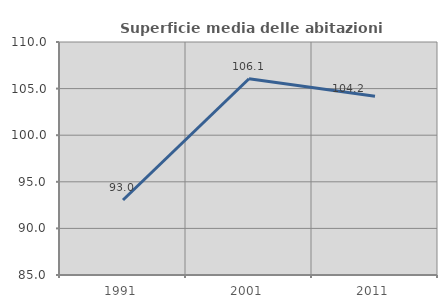
| Category | Superficie media delle abitazioni occupate |
|---|---|
| 1991.0 | 93.043 |
| 2001.0 | 106.058 |
| 2011.0 | 104.19 |